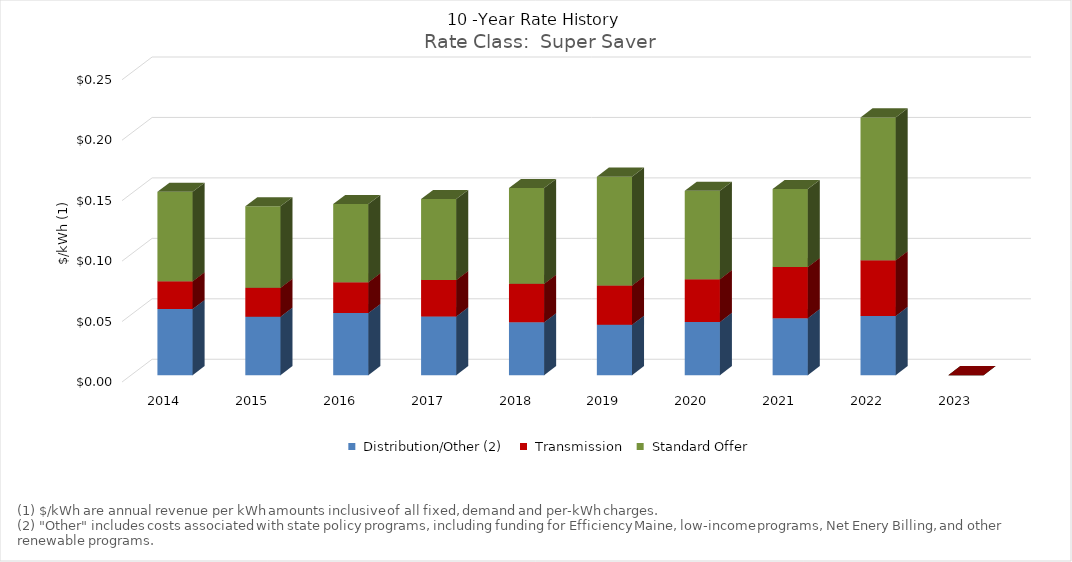
| Category | Series 1 | Series 2 | Series 3 |
|---|---|---|---|
| 2014.0 | 0.055 | 0.023 | 0.074 |
| 2015.0 | 0.048 | 0.024 | 0.067 |
| 2016.0 | 0.051 | 0.025 | 0.065 |
| 2017.0 | 0.049 | 0.03 | 0.067 |
| 2018.0 | 0.044 | 0.032 | 0.079 |
| 2019.0 | 0.042 | 0.033 | 0.09 |
| 2020.0 | 0.044 | 0.035 | 0.073 |
| 2021.0 | 0.047 | 0.042 | 0.064 |
| 2022.0 | 0.049 | 0.046 | 0.118 |
| 2023.0 | 0 | 0 | 0 |